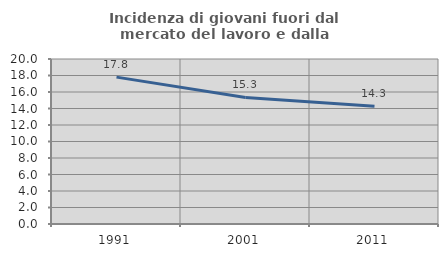
| Category | Incidenza di giovani fuori dal mercato del lavoro e dalla formazione  |
|---|---|
| 1991.0 | 17.803 |
| 2001.0 | 15.335 |
| 2011.0 | 14.286 |